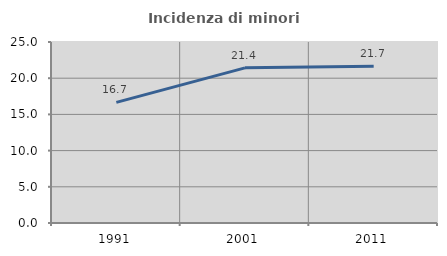
| Category | Incidenza di minori stranieri |
|---|---|
| 1991.0 | 16.667 |
| 2001.0 | 21.429 |
| 2011.0 | 21.667 |